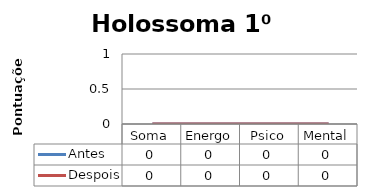
| Category | Antes | Despois |
|---|---|---|
| Soma | 0 | 0 |
| Energo | 0 | 0 |
| Psico | 0 | 0 |
| Mental | 0 | 0 |